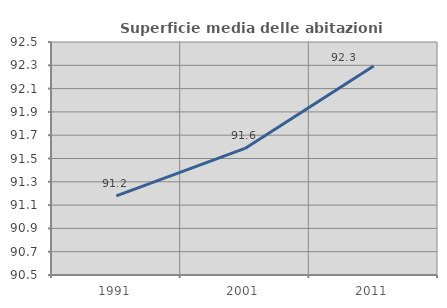
| Category | Superficie media delle abitazioni occupate |
|---|---|
| 1991.0 | 91.179 |
| 2001.0 | 91.586 |
| 2011.0 | 92.295 |